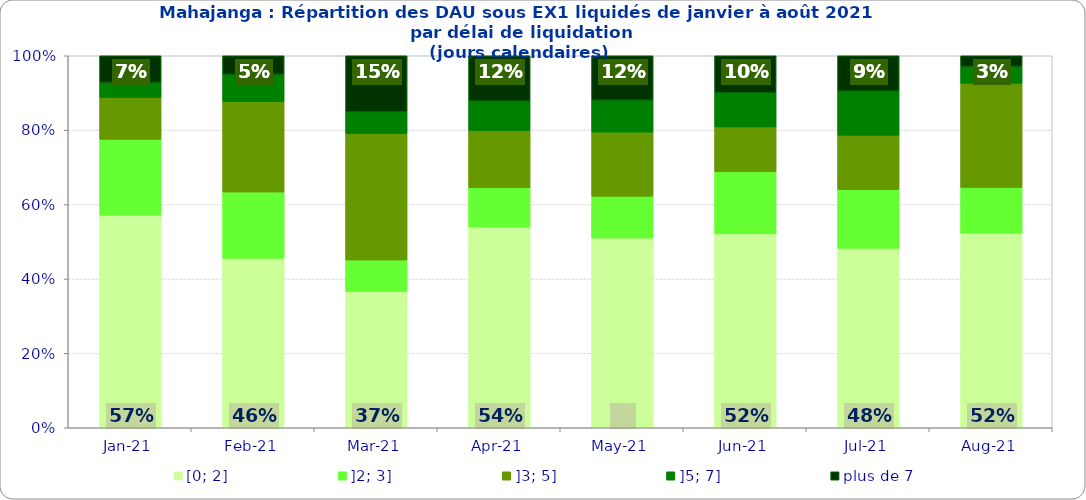
| Category | [0; 2] | ]2; 3] | ]3; 5] | ]5; 7] | plus de 7 |
|---|---|---|---|---|---|
| 2021-01-01 | 0.571 | 0.204 | 0.112 | 0.041 | 0.071 |
| 2021-02-01 | 0.455 | 0.178 | 0.243 | 0.074 | 0.05 |
| 2021-03-01 | 0.366 | 0.085 | 0.34 | 0.059 | 0.15 |
| 2021-04-01 | 0.54 | 0.106 | 0.153 | 0.079 | 0.122 |
| 2021-05-01 | 0.51 | 0.113 | 0.172 | 0.086 | 0.119 |
| 2021-06-01 | 0.521 | 0.167 | 0.121 | 0.092 | 0.099 |
| 2021-07-01 | 0.482 | 0.158 | 0.146 | 0.119 | 0.095 |
| 2021-08-01 | 0.523 | 0.123 | 0.28 | 0.045 | 0.029 |